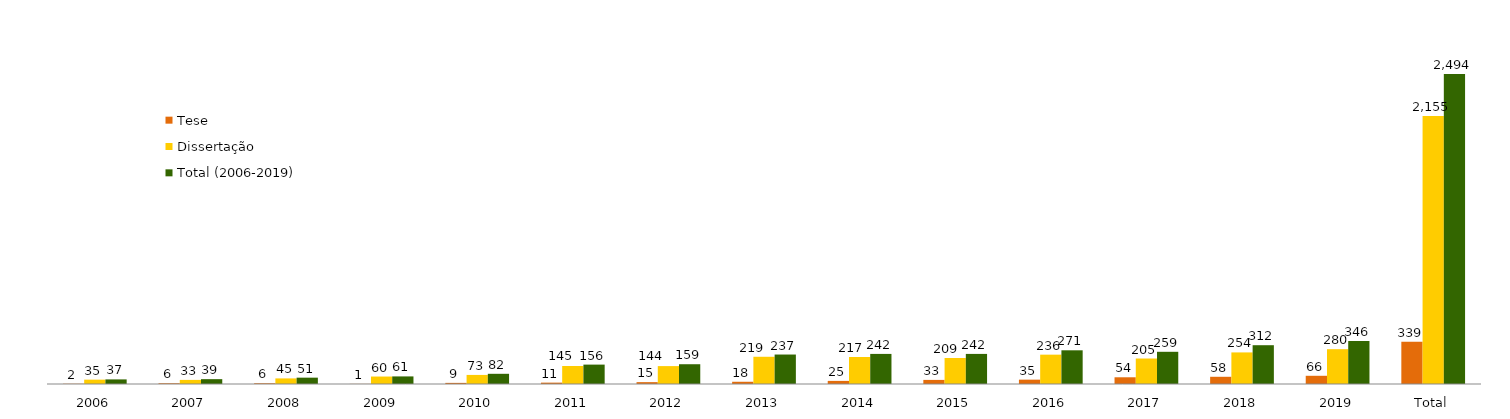
| Category | Tese | Dissertação | Total (2006-2019) |
|---|---|---|---|
| 2006 | 2 | 35 | 37 |
| 2007 | 6 | 33 | 39 |
| 2008 | 6 | 45 | 51 |
| 2009 | 1 | 60 | 61 |
| 2010 | 9 | 73 | 82 |
| 2011 | 11 | 145 | 156 |
| 2012 | 15 | 144 | 159 |
| 2013 | 18 | 219 | 237 |
| 2014 | 25 | 217 | 242 |
| 2015 | 33 | 209 | 242 |
| 2016 | 35 | 236 | 271 |
| 2017 | 54 | 205 | 259 |
| 2018 | 58 | 254 | 312 |
| 2019 | 66 | 280 | 346 |
| Total | 339 | 2155 | 2494 |